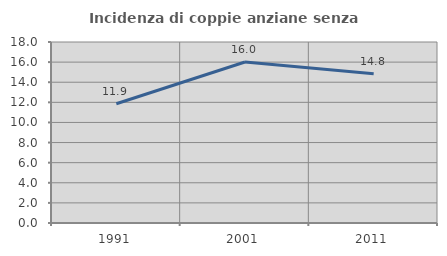
| Category | Incidenza di coppie anziane senza figli  |
|---|---|
| 1991.0 | 11.859 |
| 2001.0 | 16.007 |
| 2011.0 | 14.845 |